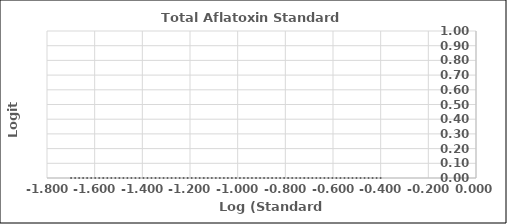
| Category | Series 0 |
|---|---|
| -1.6989700043360187 | 0 |
| -1.3010299956639813 | 0 |
| -1.0 | 0 |
| -0.6989700043360187 | 0 |
| -0.3979400086720376 | 0 |